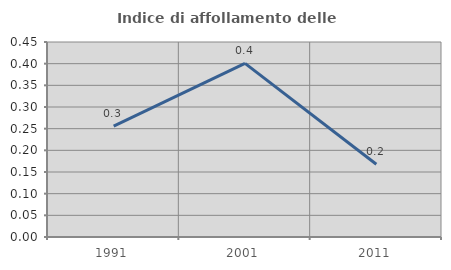
| Category | Indice di affollamento delle abitazioni  |
|---|---|
| 1991.0 | 0.256 |
| 2001.0 | 0.401 |
| 2011.0 | 0.168 |